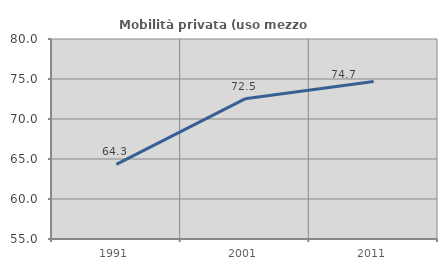
| Category | Mobilità privata (uso mezzo privato) |
|---|---|
| 1991.0 | 64.338 |
| 2001.0 | 72.519 |
| 2011.0 | 74.68 |